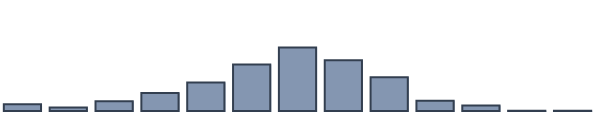
| Category | Series 0 |
|---|---|
| 0 | 2.467 |
| 1 | 1.277 |
| 2 | 3.485 |
| 3 | 6.497 |
| 4 | 10.294 |
| 5 | 16.792 |
| 6 | 22.859 |
| 7 | 18.314 |
| 8 | 12.179 |
| 9 | 3.713 |
| 10 | 1.957 |
| 11 | 0.113 |
| 12 | 0.052 |